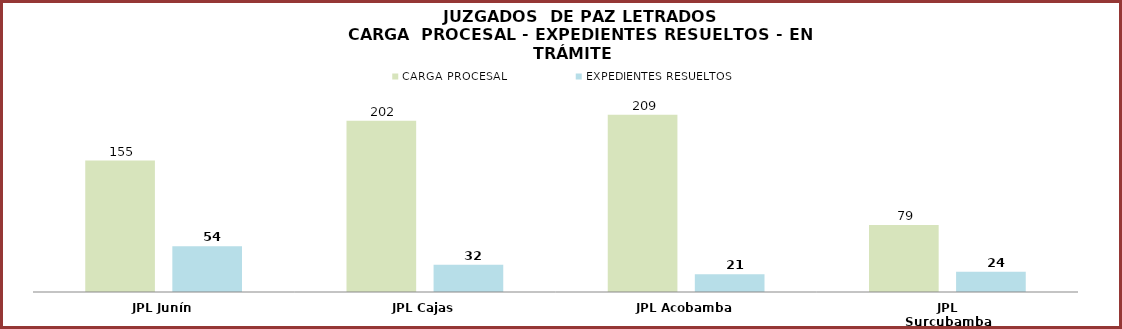
| Category | CARGA PROCESAL | EXPEDIENTES RESUELTOS |
|---|---|---|
| JPL Junín | 155 | 54 |
| JPL Cajas | 202 | 32 |
| JPL Acobamba | 209 | 21 |
| JPL Surcubamba | 79 | 24 |